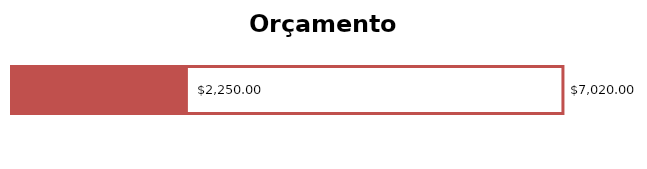
| Category | Renda Total | Despesa Total |
|---|---|---|
| 0 | 7020 | 2250 |